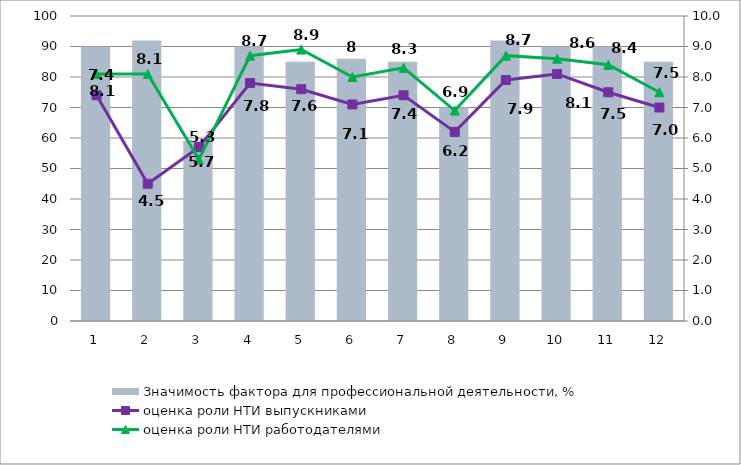
| Category | Значимость фактора для профессиональной деятельности, % |
|---|---|
| 1.0 | 90 |
| 2.0 | 92 |
| 3.0 | 59 |
| 4.0 | 90 |
| 5.0 | 85 |
| 6.0 | 86 |
| 7.0 | 85 |
| 8.0 | 70 |
| 9.0 | 92 |
| 10.0 | 90 |
| 11.0 | 90 |
| 12.0 | 85 |